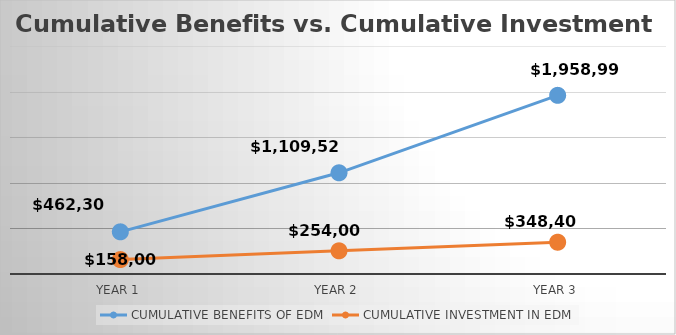
| Category | CUMULATIVE BENEFITS OF EDM | CUMULATIVE INVESTMENT IN EDM |
|---|---|---|
| Year 1 | 462300 | 158000 |
| Year 2 | 1109520 | 254000 |
| Year 3 | 1958996.25 | 348400 |